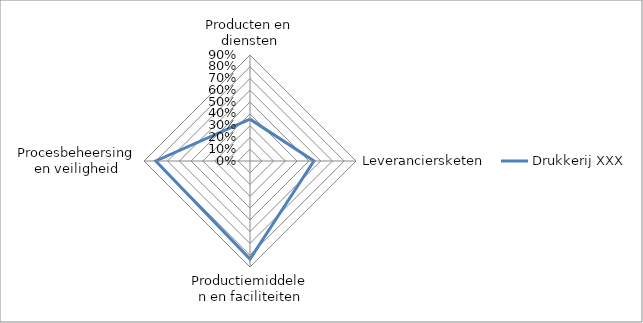
| Category | Drukkerij XXX |
|---|---|
| Producten en diensten | 0.356 |
| Leveranciersketen | 0.543 |
| Productiemiddelen en faciliteiten | 0.833 |
| Procesbeheersing en veiligheid | 0.8 |